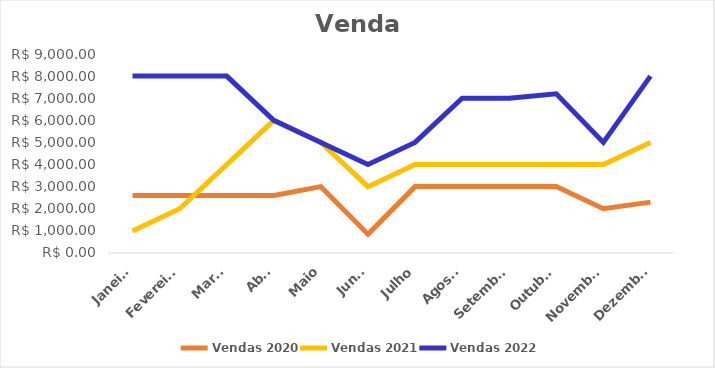
| Category | Vendas 2020 | Vendas 2021 | Vendas 2022 |
|---|---|---|---|
| Janeiro | 2600 | 1000 | 8000 |
| Fevereiro | 2601 | 2000 | 8000 |
| Março | 2602 | 4000 | 8000 |
| Abril | 2603 | 6000 | 6000 |
| Maio | 3000 | 5000 | 5000 |
| Junho | 850 | 3000 | 4000 |
| Julho | 3002 | 4000 | 5000 |
| Agosto | 3003 | 4000 | 7000 |
| Setembro | 3004 | 4000 | 7000 |
| Outubro | 3005 | 4000 | 7200 |
| Novembro | 2000 | 4000 | 5000 |
| Dezembro | 2300 | 5000 | 8000 |